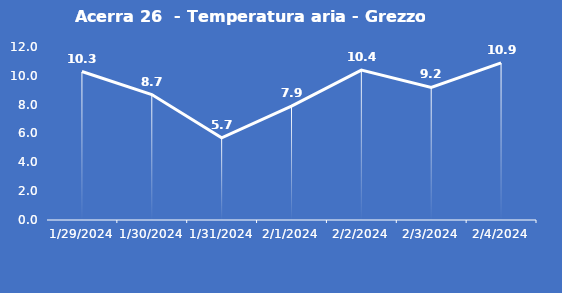
| Category | Acerra 26  - Temperatura aria - Grezzo (°C) |
|---|---|
| 1/29/24 | 10.3 |
| 1/30/24 | 8.7 |
| 1/31/24 | 5.7 |
| 2/1/24 | 7.9 |
| 2/2/24 | 10.4 |
| 2/3/24 | 9.2 |
| 2/4/24 | 10.9 |